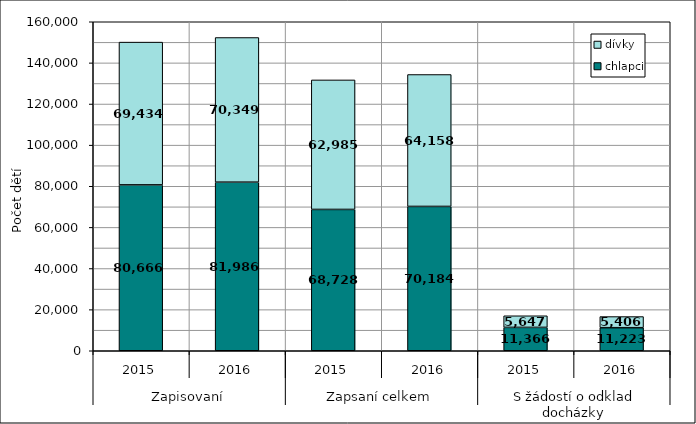
| Category | chlapci | dívky |
|---|---|---|
| 0 | 80666 | 69434 |
| 1 | 81986 | 70349 |
| 2 | 68728 | 62985 |
| 3 | 70184 | 64158 |
| 4 | 11366 | 5647 |
| 5 | 11223 | 5406 |